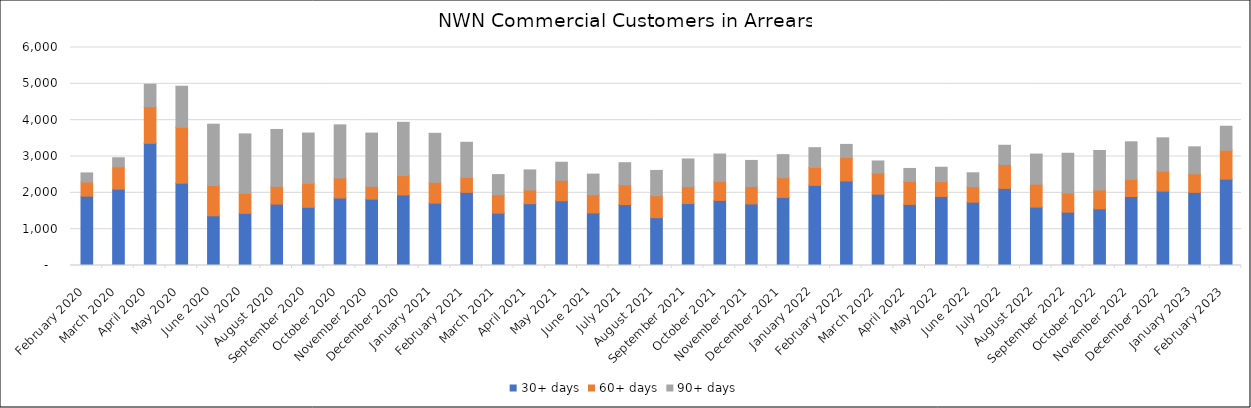
| Category | 30+ days | 60+ days | 90+ days |
|---|---|---|---|
| 2020-02-01 | 1909 | 387 | 252 |
| 2020-03-01 | 2102 | 610 | 253 |
| 2020-04-01 | 3362 | 1008 | 618 |
| 2020-05-01 | 2265 | 1536 | 1133 |
| 2020-06-01 | 1367 | 835 | 1687 |
| 2020-07-01 | 1435 | 550 | 1637 |
| 2020-08-01 | 1690 | 488 | 1566 |
| 2020-09-01 | 1601 | 659 | 1385 |
| 2020-10-01 | 1857 | 551 | 1463 |
| 2020-11-01 | 1827 | 353 | 1464 |
| 2020-12-01 | 1942 | 532 | 1466 |
| 2021-01-01 | 1717 | 569 | 1352 |
| 2021-02-01 | 2014 | 410 | 968 |
| 2021-03-01 | 1440 | 508 | 554 |
| 2021-04-01 | 1701 | 377 | 553 |
| 2021-05-01 | 1782 | 563 | 497 |
| 2021-06-01 | 1447 | 501 | 568 |
| 2021-07-01 | 1677 | 542 | 611 |
| 2021-08-01 | 1317 | 604 | 695 |
| 2021-09-01 | 1705 | 465 | 762 |
| 2021-10-01 | 1792 | 522 | 754 |
| 2021-11-01 | 1695 | 479 | 718 |
| 2021-12-01 | 1873 | 545 | 634 |
| 2022-01-01 | 2206 | 495 | 542 |
| 2022-02-01 | 2326 | 652 | 355 |
| 2022-03-01 | 1962 | 580 | 335 |
| 2022-04-01 | 1682 | 632 | 357 |
| 2022-05-01 | 1901 | 408 | 395 |
| 2022-06-01 | 1743 | 424 | 385 |
| 2022-07-01 | 2122 | 659 | 528 |
| 2022-08-01 | 1608 | 631 | 828 |
| 2022-09-01 | 1468 | 523 | 1098 |
| 2022-10-01 | 1561 | 516 | 1089 |
| 2022-11-01 | 1898 | 471 | 1035 |
| 2022-12-01 | 2048 | 546 | 920 |
| 2023-01-01 | 2013 | 509 | 744 |
| 2023-02-01 | 2377 | 794 | 662 |